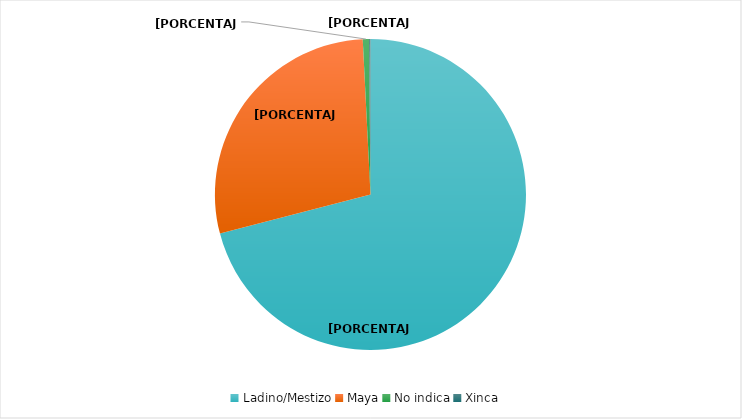
| Category | Series 0 |
|---|---|
| Ladino/Mestizo | 1429 |
| Maya | 569 |
| No indica | 13 |
| Xinca | 3 |